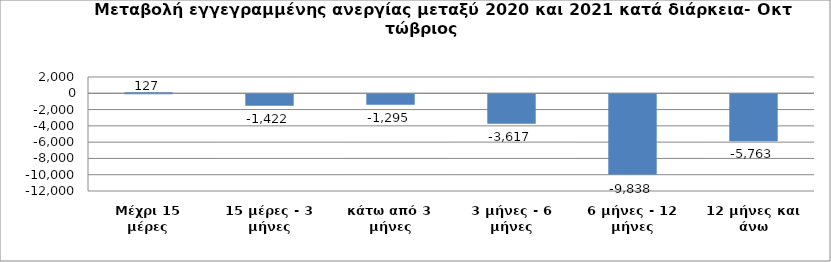
| Category | Series 0 |
|---|---|
| Μέχρι 15 μέρες | 127 |
| 15 μέρες - 3 μήνες | -1422 |
| κάτω από 3 μήνες | -1295 |
| 3 μήνες - 6 μήνες | -3617 |
| 6 μήνες - 12 μήνες | -9838 |
| 12 μήνες και άνω | -5763 |